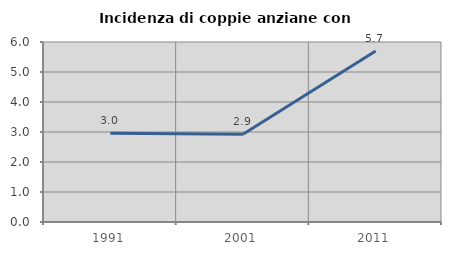
| Category | Incidenza di coppie anziane con figli |
|---|---|
| 1991.0 | 2.955 |
| 2001.0 | 2.928 |
| 2011.0 | 5.702 |